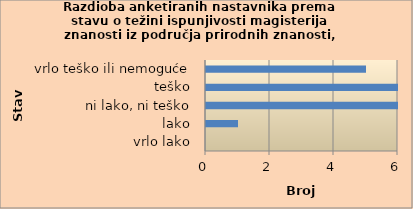
| Category | Series 0 |
|---|---|
| vrlo lako | 0 |
| lako | 1 |
| ni lako, ni teško | 6 |
| teško | 6 |
| vrlo teško ili nemoguće | 5 |